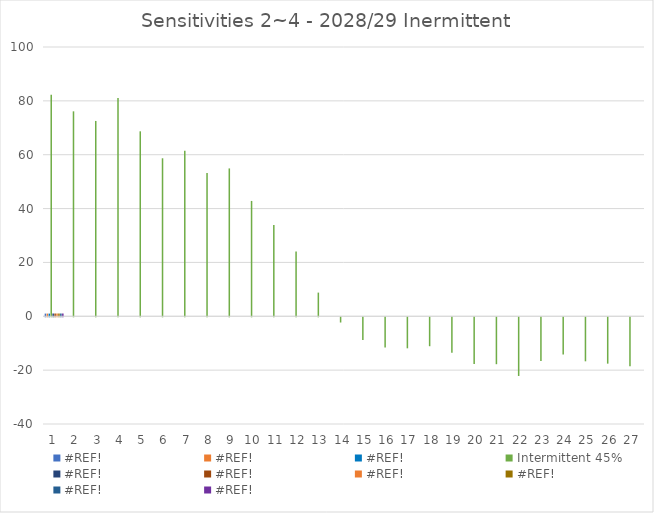
| Category | #REF! | Intermittent 45% |
|---|---|---|
| 0 | 1 |  |